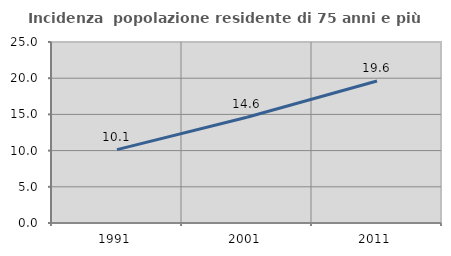
| Category | Incidenza  popolazione residente di 75 anni e più |
|---|---|
| 1991.0 | 10.13 |
| 2001.0 | 14.61 |
| 2011.0 | 19.613 |